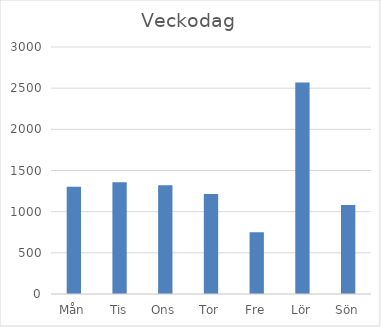
| Category | Summa |
|---|---|
| Mån | 1302 |
| Tis | 1356 |
| Ons | 1321 |
| Tor | 1216 |
| Fre | 750 |
| Lör | 2568 |
| Sön | 1082 |